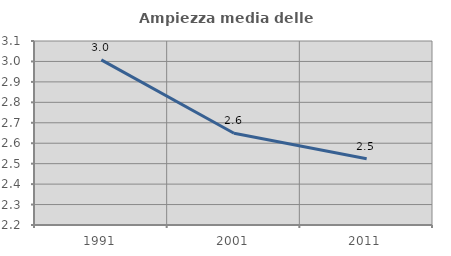
| Category | Ampiezza media delle famiglie |
|---|---|
| 1991.0 | 3.008 |
| 2001.0 | 2.649 |
| 2011.0 | 2.524 |